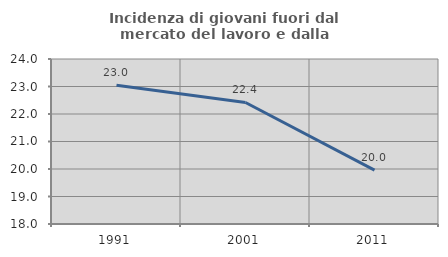
| Category | Incidenza di giovani fuori dal mercato del lavoro e dalla formazione  |
|---|---|
| 1991.0 | 23.049 |
| 2001.0 | 22.419 |
| 2011.0 | 19.959 |